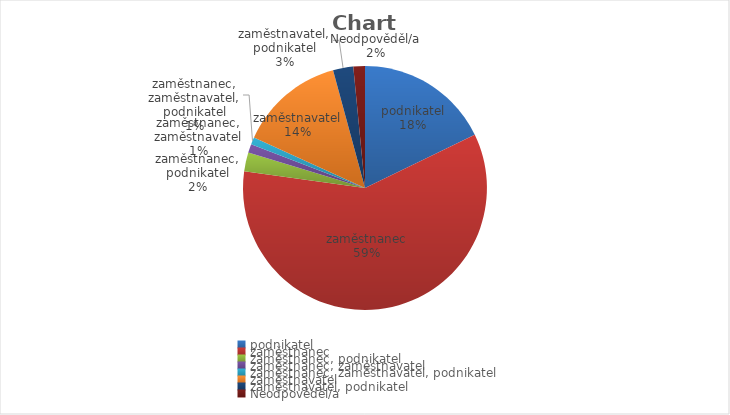
| Category | Series 0 |
|---|---|
| podnikatel | 93 |
| zaměstnanec | 310 |
| zaměstnanec, podnikatel | 13 |
| zaměstnanec, zaměstnavatel | 6 |
| zaměstnanec, zaměstnavatel, podnikatel | 5 |
| zaměstnavatel | 73 |
| zaměstnavatel, podnikatel | 14 |
| Neodpověděl/a | 8 |